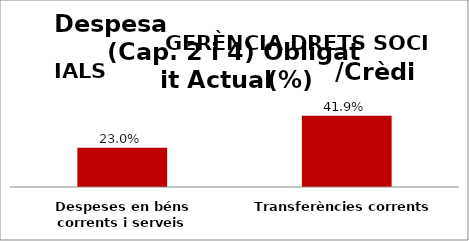
| Category | Series 0 |
|---|---|
| Despeses en béns corrents i serveis | 0.23 |
| Transferències corrents | 0.419 |